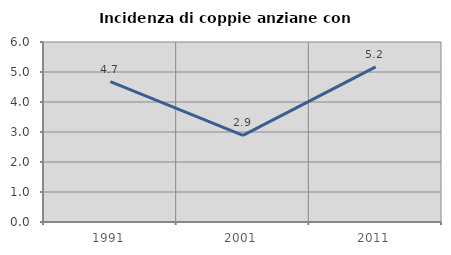
| Category | Incidenza di coppie anziane con figli |
|---|---|
| 1991.0 | 4.678 |
| 2001.0 | 2.89 |
| 2011.0 | 5.172 |